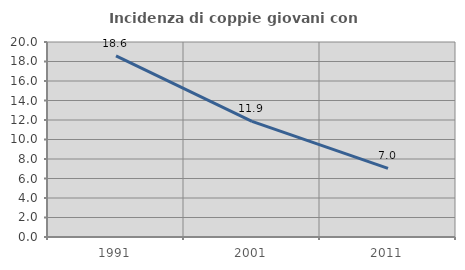
| Category | Incidenza di coppie giovani con figli |
|---|---|
| 1991.0 | 18.571 |
| 2001.0 | 11.851 |
| 2011.0 | 7.043 |